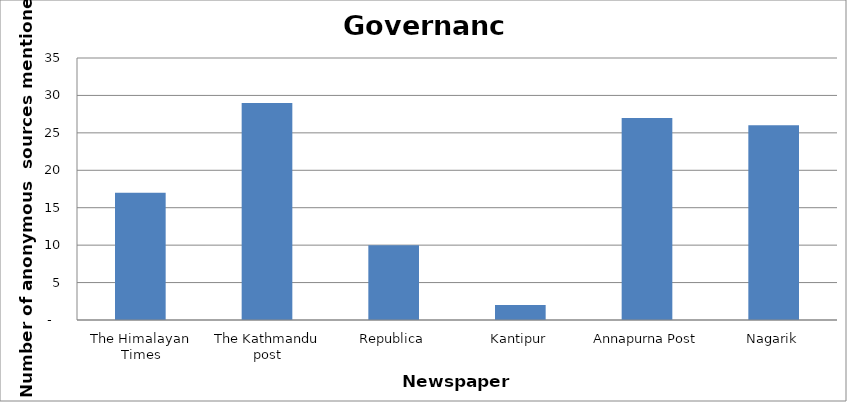
| Category | Governance |
|---|---|
| The Himalayan Times | 17 |
| The Kathmandu post | 29 |
| Republica | 10 |
| Kantipur | 2 |
| Annapurna Post | 27 |
| Nagarik | 26 |